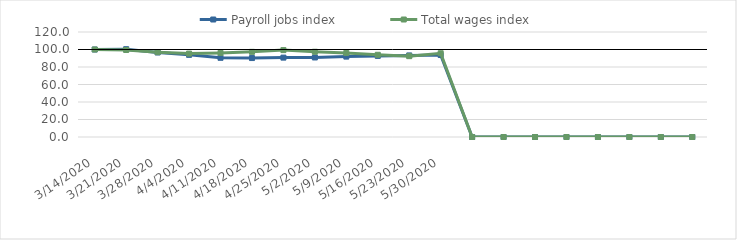
| Category | Payroll jobs index | Total wages index |
|---|---|---|
| 14/03/2020 | 100 | 100 |
| 21/03/2020 | 100.367 | 99.419 |
| 28/03/2020 | 96.575 | 96.981 |
| 04/04/2020 | 93.876 | 95.315 |
| 11/04/2020 | 90.514 | 96.128 |
| 18/04/2020 | 90.217 | 97.321 |
| 25/04/2020 | 90.718 | 99.305 |
| 02/05/2020 | 90.885 | 97.419 |
| 09/05/2020 | 91.873 | 96.041 |
| 16/05/2020 | 92.689 | 93.953 |
| 23/05/2020 | 93.236 | 92.386 |
| 30/05/2020 | 93.661 | 95.717 |